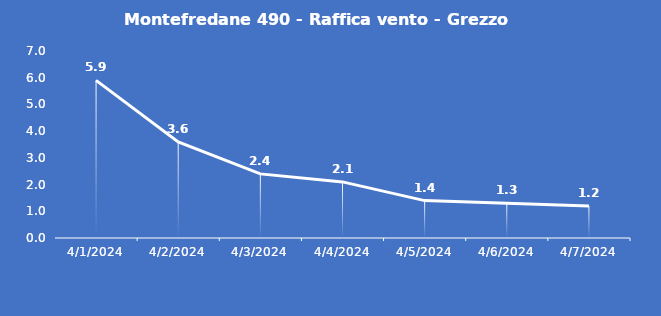
| Category | Montefredane 490 - Raffica vento - Grezzo (m/s) |
|---|---|
| 4/1/24 | 5.9 |
| 4/2/24 | 3.6 |
| 4/3/24 | 2.4 |
| 4/4/24 | 2.1 |
| 4/5/24 | 1.4 |
| 4/6/24 | 1.3 |
| 4/7/24 | 1.2 |